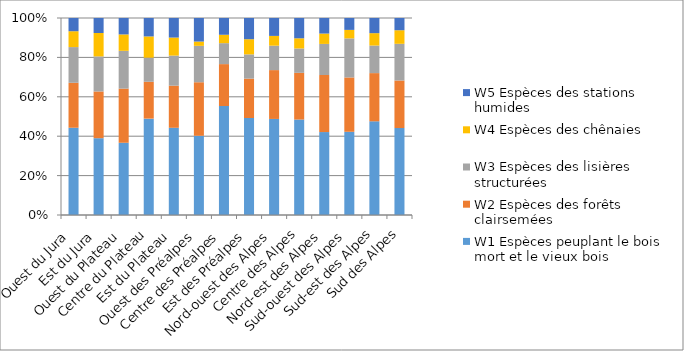
| Category | W1 Espèces peuplant le bois mort et le vieux bois | W2 Espèces des forêts clairsemées | W3 Espèces des lisières structurées | W4 Espèces des chênaies | W5 Espèces des stations humides |
|---|---|---|---|---|---|
| Ouest du Jura | 66 | 34 | 27 | 12 | 10 |
| Est du Jura | 46 | 28 | 21 | 14 | 9 |
| Ouest du Plateau | 44 | 33 | 23 | 10 | 10 |
| Centre du Plateau | 68 | 26 | 17 | 15 | 13 |
| Est du Plateau | 58 | 28 | 20 | 12 | 13 |
| Ouest des Préalpes | 37 | 25 | 17 | 2 | 11 |
| Centre des Préalpes | 78 | 30 | 15 | 6 | 12 |
| Est des Préalpes | 64 | 26 | 16 | 10 | 14 |
| Nord-ouest des Alpes | 59 | 30 | 15 | 6 | 11 |
| Centre des Alpes | 47 | 23 | 12 | 5 | 10 |
| Nord-est des Alpes | 32 | 22 | 12 | 4 | 6 |
| Sud-ouest des Alpes | 49 | 32 | 23 | 5 | 7 |
| Sud-est des Alpes | 68 | 35 | 20 | 9 | 11 |
| Sud des Alpes | 64 | 35 | 27 | 10 | 9 |